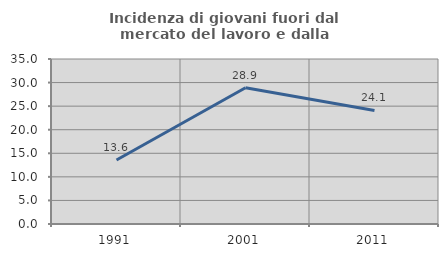
| Category | Incidenza di giovani fuori dal mercato del lavoro e dalla formazione  |
|---|---|
| 1991.0 | 13.571 |
| 2001.0 | 28.914 |
| 2011.0 | 24.086 |